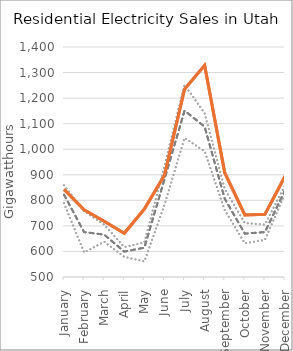
| Category | 5-year Max | 5-year Min | 5-year Avg | 2020 |
|---|---|---|---|---|
| January | 859 | 789 | 822.2 | 843 |
| February | 758 | 596 | 675.8 | 763 |
| March | 705 | 638 | 665.8 | 718 |
| April | 617 | 579 | 599.4 | 671 |
| May | 635 | 561 | 614.8 | 766 |
| June | 935 | 782 | 882.2 | 898 |
| July | 1252 | 1044 | 1151 | 1235 |
| August | 1141 | 992 | 1088.2 | 1328 |
| September | 844 | 762 | 806.2 | 908 |
| October | 711 | 632 | 669.8 | 743 |
| November | 705 | 645 | 675.8 | 745 |
| December | 858 | 826 | 839.4 | 894 |